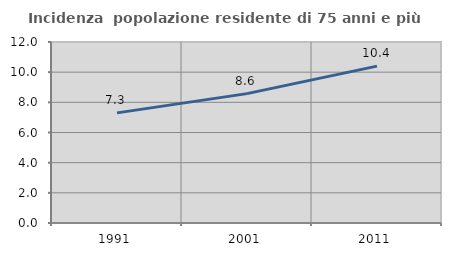
| Category | Incidenza  popolazione residente di 75 anni e più |
|---|---|
| 1991.0 | 7.302 |
| 2001.0 | 8.576 |
| 2011.0 | 10.402 |